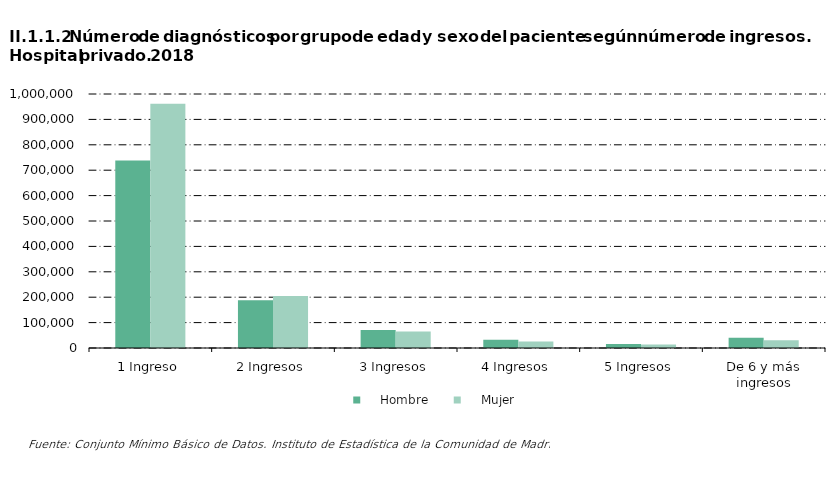
| Category |     Hombre |     Mujer |
|---|---|---|
| 1 Ingreso | 738660 | 961623 |
| 2 Ingresos | 187759 | 204893 |
| 3 Ingresos | 70941 | 65065 |
| 4 Ingresos | 32201 | 25974 |
| 5 Ingresos | 16016 | 13533 |
| De 6 y más ingresos | 40638 | 30628 |